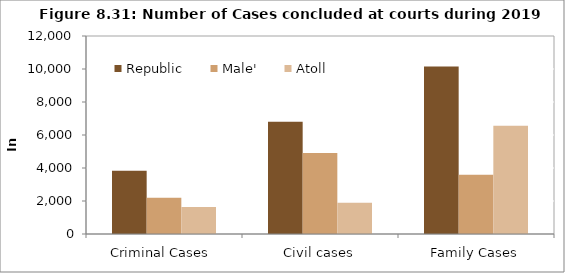
| Category | Republic  | Male'  | Atoll  |
|---|---|---|---|
| Criminal Cases  | 3830 | 2190 | 1640 |
| Civil cases | 6803 | 4907 | 1896 |
| Family Cases | 10155 | 3589 | 6566 |